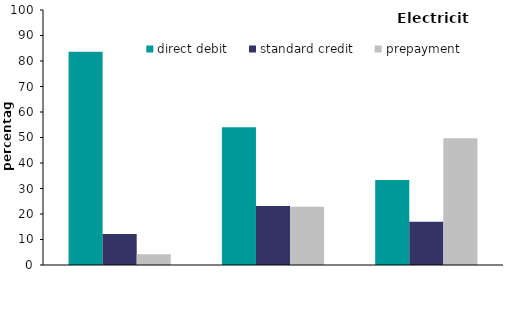
| Category | direct debit | standard credit | prepayment |
|---|---|---|---|
| owner occupiers | 83.63 | 12.125 | 4.244 |
| private renters | 54.048 | 23.124 | 22.828 |
| social renters | 33.352 | 16.95 | 49.698 |